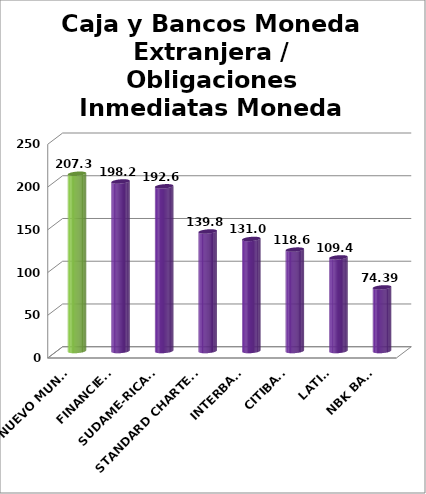
| Category | Series 0 |
|---|---|
| BANCO NUEVO MUNDO | 207.35 |
| FINANCIERO | 198.29 |
| SUDAME-RICANO | 192.63 |
| STANDARD CHARTERED | 139.81 |
| INTERBANK | 131.05 |
| CITIBANK | 118.61 |
| LATINO | 109.49 |
| NBK BANK  | 74.39 |